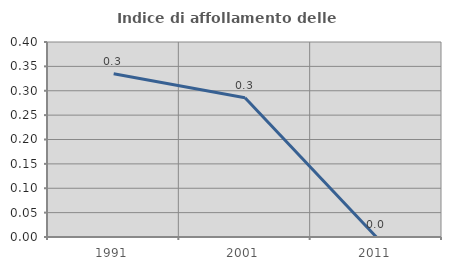
| Category | Indice di affollamento delle abitazioni  |
|---|---|
| 1991.0 | 0.335 |
| 2001.0 | 0.286 |
| 2011.0 | 0 |